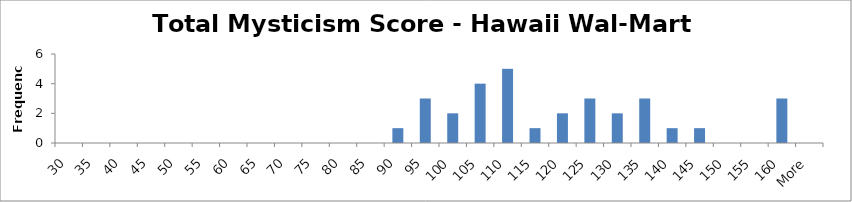
| Category | Frequency |
|---|---|
| 30 | 0 |
| 35 | 0 |
| 40 | 0 |
| 45 | 0 |
| 50 | 0 |
| 55 | 0 |
| 60 | 0 |
| 65 | 0 |
| 70 | 0 |
| 75 | 0 |
| 80 | 0 |
| 85 | 0 |
| 90 | 1 |
| 95 | 3 |
| 100 | 2 |
| 105 | 4 |
| 110 | 5 |
| 115 | 1 |
| 120 | 2 |
| 125 | 3 |
| 130 | 2 |
| 135 | 3 |
| 140 | 1 |
| 145 | 1 |
| 150 | 0 |
| 155 | 0 |
| 160 | 3 |
| More | 0 |